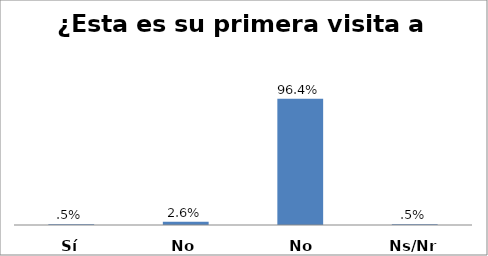
| Category | Series 0 |
|---|---|
| Sí | 0.005 |
| No | 0.026 |
| No aplica | 0.964 |
| Ns/Nr | 0.005 |